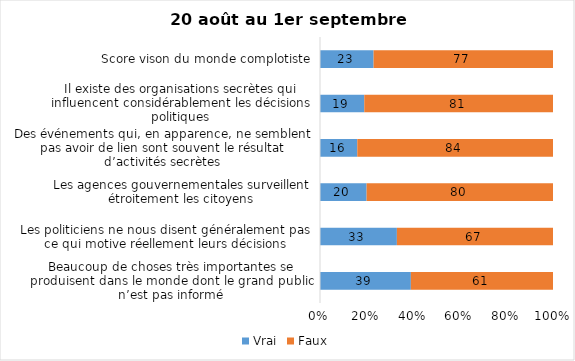
| Category | Vrai | Faux |
|---|---|---|
| Beaucoup de choses très importantes se produisent dans le monde dont le grand public n’est pas informé | 39 | 61 |
| Les politiciens ne nous disent généralement pas ce qui motive réellement leurs décisions | 33 | 67 |
| Les agences gouvernementales surveillent étroitement les citoyens | 20 | 80 |
| Des événements qui, en apparence, ne semblent pas avoir de lien sont souvent le résultat d’activités secrètes | 16 | 84 |
| Il existe des organisations secrètes qui influencent considérablement les décisions politiques | 19 | 81 |
| Score vison du monde complotiste | 23 | 77 |